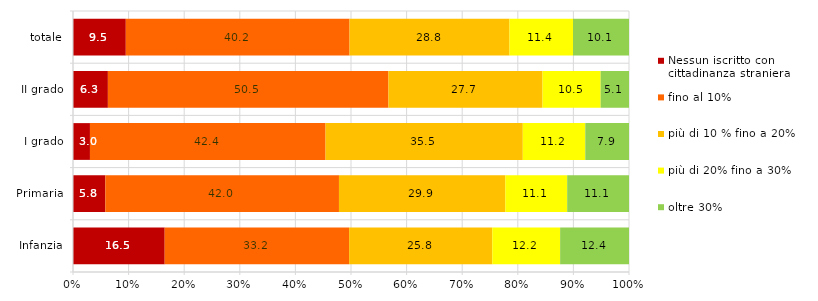
| Category | Nessun iscritto con cittadinanza straniera | fino al 10% | più di 10 % fino a 20% | più di 20% fino a 30% | oltre 30% |
|---|---|---|---|---|---|
| Infanzia | 16.493 | 33.17 | 25.751 | 12.201 | 12.385 |
| Primaria | 5.821 | 42.015 | 29.925 | 11.119 | 11.119 |
|  I grado | 3.05 | 42.376 | 35.474 | 11.236 | 7.865 |
|  II grado | 6.275 | 50.458 | 27.712 | 10.458 | 5.098 |
| totale | 9.498 | 40.239 | 28.768 | 11.425 | 10.071 |